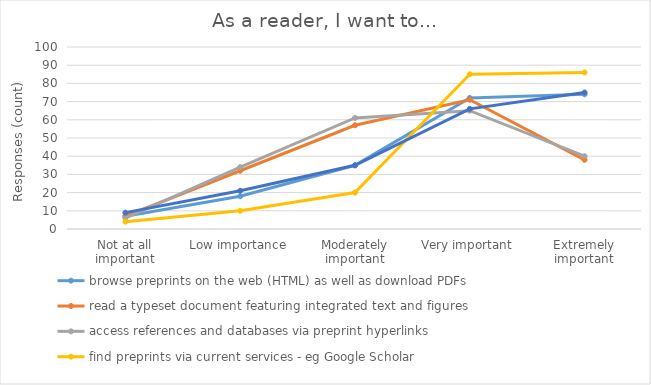
| Category | browse preprints on the web (HTML) as well as download PDFs | read a typeset document featuring integrated text and figures | access references and databases via preprint hyperlinks | find preprints via current services - eg Google Scholar | find preprints via services like PubMed, Web of Science, Scopus (now for peer reviewed papers) |
|---|---|---|---|---|---|
| Not at all important | 7 | 7 | 6 | 4 | 9 |
| Low importance | 18 | 32 | 34 | 10 | 21 |
| Moderately important | 35 | 57 | 61 | 20 | 35 |
| Very important | 72 | 71 | 65 | 85 | 66 |
| Extremely important | 74 | 38 | 40 | 86 | 75 |